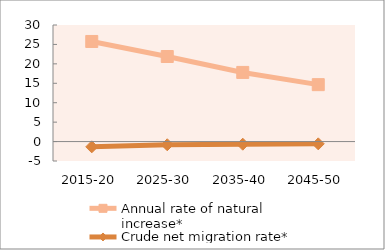
| Category | Annual rate of natural increase* | Crude net migration rate* |
|---|---|---|
| 2015-20 | 25.759 | -1.355 |
| 2025-30 | 21.892 | -0.821 |
| 2035-40 | 17.795 | -0.679 |
| 2045-50 | 14.651 | -0.581 |